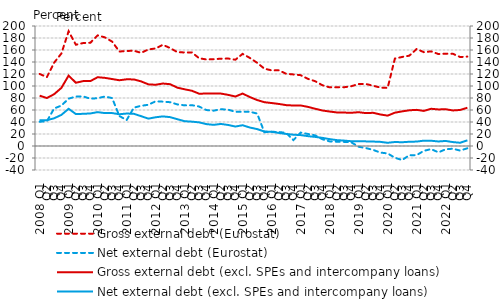
| Category | Gross external debt (Eurostat) | Net external debt (Eurostat) | Gross external debt (excl. SPEs and intercompany loans) |
|---|---|---|---|
|   2008 Q1 | 120.095 | 40.4 | 83.857 |
| Q2 | 114.77 | 41.3 | 79.961 |
| Q3 | 138.881 | 62.5 | 86.324 |
| Q4 | 154.146 | 67.4 | 96.87 |
|   2009 Q1 | 191.233 | 78.9 | 117.325 |
| Q2 | 168.777 | 82.4 | 105.436 |
| Q3 | 171.587 | 82.6 | 108.132 |
| Q4 | 172.092 | 78.8 | 108.199 |
|  2010 Q1 | 184.399 | 79.7 | 114.644 |
| Q2 | 181.075 | 82.4 | 113.577 |
| Q3 | 173.985 | 79.9 | 111.598 |
| Q4 | 157.463 | 50 | 109.6 |
|  2011 Q1 | 158.346 | 43.2 | 111.153 |
| Q2 | 158.832 | 63.9 | 110.959 |
| Q3 | 155.275 | 67 | 107.673 |
| Q4 | 160.912 | 68.7 | 102.749 |
|  2012 Q1 | 162.597 | 74.5 | 102.077 |
| Q2 | 168.703 | 73.9 | 104.115 |
| Q3 | 163.181 | 73 | 102.998 |
| Q4 | 156.48 | 69.3 | 97.225 |
|  2013 Q1 | 155.874 | 67.7 | 94.495 |
| Q2 | 155.938 | 68 | 92.085 |
| Q3 | 146.263 | 65.8 | 87.148 |
| Q4 | 144.207 | 59.9 | 87.426 |
|  2014 Q1 | 144.703 | 58.9 | 87.515 |
| Q2 | 145.466 | 61.3 | 87.366 |
| Q3 | 145.799 | 60.6 | 85.24 |
| Q4 | 143.774 | 57 | 82.439 |
|  2015 Q1 | 153.581 | 57 | 87.432 |
| Q2 | 146.764 | 57.1 | 81.526 |
| Q3 | 138.694 | 54.1 | 76.623 |
| Q4 | 128.896 | 23 | 72.998 |
|  2016 Q1 | 126.063 | 23.7 | 71.612 |
| Q2 | 126.094 | 23.3 | 70.086 |
| Q3 | 120.396 | 21.9 | 68.124 |
| Q4 | 119.283 | 9.77 | 67.465 |
|  2017 Q1 | 118.074 | 22.408 | 67.582 |
| Q2 | 111.944 | 20.075 | 65.179 |
| Q3 | 108.022 | 17.717 | 62.12 |
| Q4 | 101.242 | 11.237 | 59.162 |
|  2018 Q1 | 97.768 | 7.672 | 57.462 |
| Q2 | 97.928 | 7.223 | 55.916 |
| Q3 | 97.945 | 6.866 | 55.699 |
| Q4 | 99.678 | 6.037 | 55.385 |
|  2019 Q1 | 103.26 | -1.224 | 56.327 |
| Q2 | 103.367 | -3.455 | 54.805 |
| Q3 | 100.398 | -6.54 | 55.332 |
| Q4 | 97.349 | -10.954 | 52.551 |
|  2020 Q1 | 96.791 | -12.382 | 50.611 |
| Q2 | 145.688 | -19.568 | 55.52 |
| Q3 | 148.375 | -23.391 | 57.712 |
| Q4 | 150.612 | -15.268 | 59.538 |
|  2021 Q1 | 161.619 | -15.208 | 60.228 |
| Q2 | 156.412 | -8.026 | 58.493 |
| Q3 | 157.693 | -5.166 | 62.04 |
| Q4 | 153.26 | -10.618 | 60.936 |
|  2022 Q1 | 153.922 | -5.465 | 61.279 |
| Q2 | 153.72 | -4.515 | 59.261 |
| Q3 | 148.281 | -7.602 | 60.033 |
| Q4 | 149.01 | -3.798 | 63.786 |